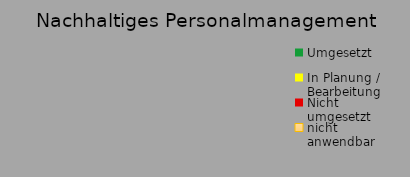
| Category | Series 1 |
|---|---|
| Umgesetzt | 0 |
| In Planung / Bearbeitung | 0 |
| Nicht umgesetzt | 0 |
| nicht anwendbar | 0 |